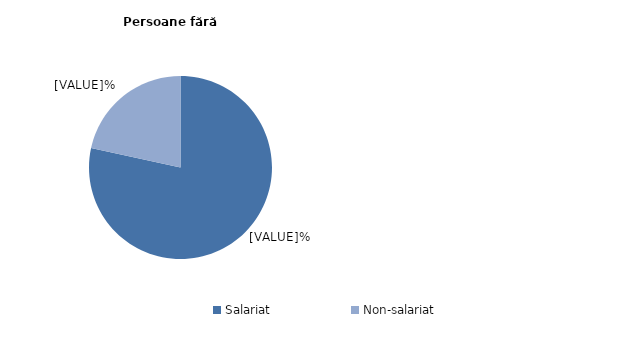
| Category | Persoane     fără    dizabilități |
|---|---|
| Salariat | 78.4 |
| Non-salariat | 21.6 |